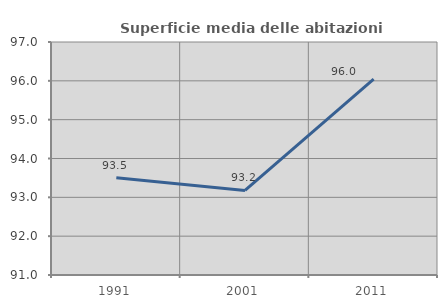
| Category | Superficie media delle abitazioni occupate |
|---|---|
| 1991.0 | 93.503 |
| 2001.0 | 93.178 |
| 2011.0 | 96.045 |